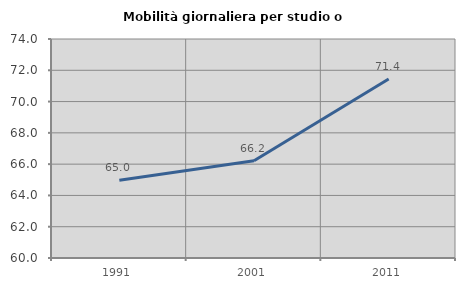
| Category | Mobilità giornaliera per studio o lavoro |
|---|---|
| 1991.0 | 64.967 |
| 2001.0 | 66.221 |
| 2011.0 | 71.447 |